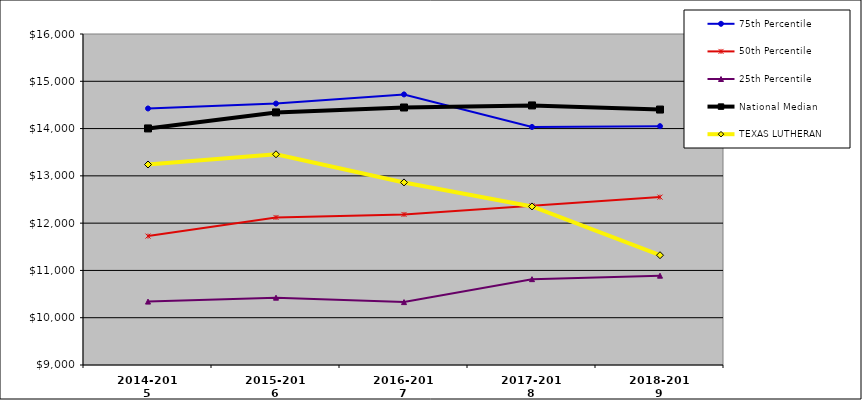
| Category | 75th Percentile | 50th Percentile | 25th Percentile | National Median | TEXAS LUTHERAN |
|---|---|---|---|---|---|
| 2014-2015 | 14424.833 | 11726.401 | 10340.745 | 14002.887 | 13239.91 |
| 2015-2016 | 14528.375 | 12120.661 | 10424.014 | 14342.086 | 13456.186 |
| 2016-2017 | 14722.345 | 12184.106 | 10330.19 | 14445.621 | 12861.172 |
| 2017-2018 | 14034.417 | 12366.889 | 10815.603 | 14489.448 | 12353.524 |
| 2018-2019 | 14050.925 | 12550.288 | 10888.806 | 14402.238 | 11322.153 |